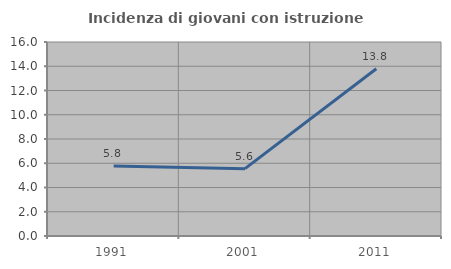
| Category | Incidenza di giovani con istruzione universitaria |
|---|---|
| 1991.0 | 5.769 |
| 2001.0 | 5.556 |
| 2011.0 | 13.793 |